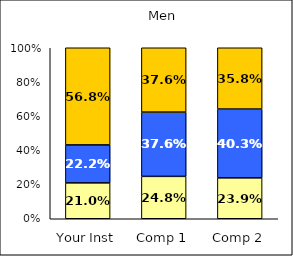
| Category | Low Social Agency | Average Social Agency | High Social Agency |
|---|---|---|---|
| Your Inst | 0.21 | 0.222 | 0.568 |
| Comp 1 | 0.248 | 0.376 | 0.376 |
| Comp 2 | 0.239 | 0.403 | 0.358 |